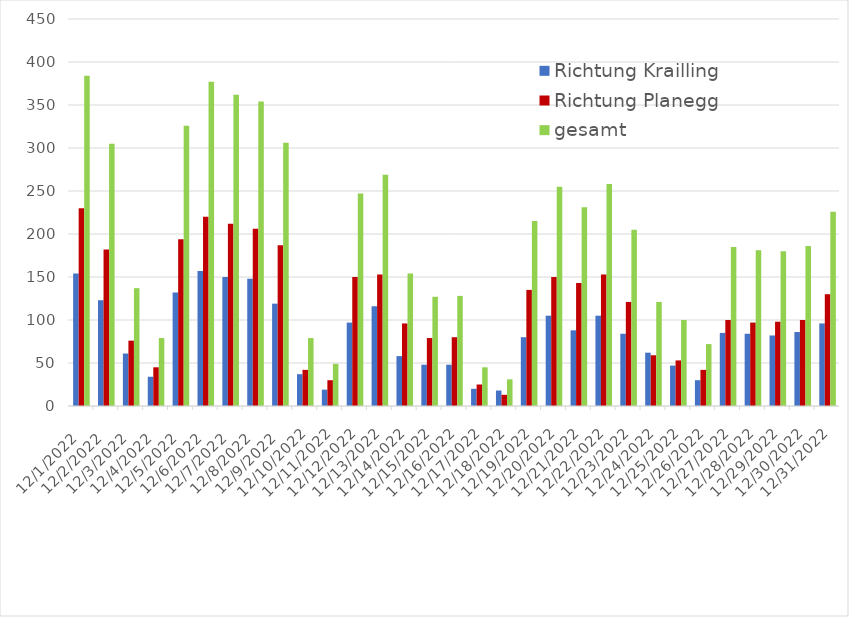
| Category | Richtung Krailling | Richtung Planegg | gesamt |
|---|---|---|---|
| 12/1/22 | 154 | 230 | 384 |
| 12/2/22 | 123 | 182 | 305 |
| 12/3/22 | 61 | 76 | 137 |
| 12/4/22 | 34 | 45 | 79 |
| 12/5/22 | 132 | 194 | 326 |
| 12/6/22 | 157 | 220 | 377 |
| 12/7/22 | 150 | 212 | 362 |
| 12/8/22 | 148 | 206 | 354 |
| 12/9/22 | 119 | 187 | 306 |
| 12/10/22 | 37 | 42 | 79 |
| 12/11/22 | 19 | 30 | 49 |
| 12/12/22 | 97 | 150 | 247 |
| 12/13/22 | 116 | 153 | 269 |
| 12/14/22 | 58 | 96 | 154 |
| 12/15/22 | 48 | 79 | 127 |
| 12/16/22 | 48 | 80 | 128 |
| 12/17/22 | 20 | 25 | 45 |
| 12/18/22 | 18 | 13 | 31 |
| 12/19/22 | 80 | 135 | 215 |
| 12/20/22 | 105 | 150 | 255 |
| 12/21/22 | 88 | 143 | 231 |
| 12/22/22 | 105 | 153 | 258 |
| 12/23/22 | 84 | 121 | 205 |
| 12/24/22 | 62 | 59 | 121 |
| 12/25/22 | 47 | 53 | 100 |
| 12/26/22 | 30 | 42 | 72 |
| 12/27/22 | 85 | 100 | 185 |
| 12/28/22 | 84 | 97 | 181 |
| 12/29/22 | 82 | 98 | 180 |
| 12/30/22 | 86 | 100 | 186 |
| 12/31/22 | 96 | 130 | 226 |